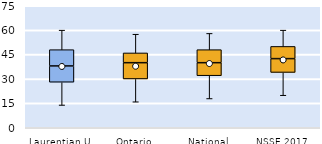
| Category | 25th | 50th | 75th |
|---|---|---|---|
| Laurentian U | 28 | 10 | 10 |
| Ontario | 30 | 10 | 6 |
| National | 32 | 8 | 8 |
| NSSE 2017 | 34 | 8.5 | 7.5 |